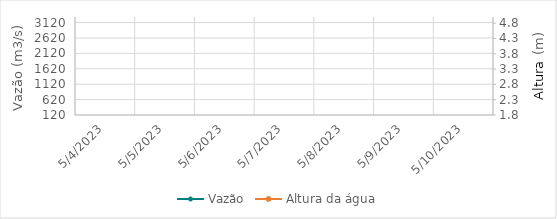
| Category | Vazão |
|---|---|
| 5/10/23 | 2040 |
| 5/9/23 | 2028.7 |
| 5/8/23 | 1903.33 |
| 5/7/23 | 1668.28 |
| 5/6/23 | 1382.92 |
| 5/5/23 | 1313.48 |
| 5/4/23 | 1229.13 |